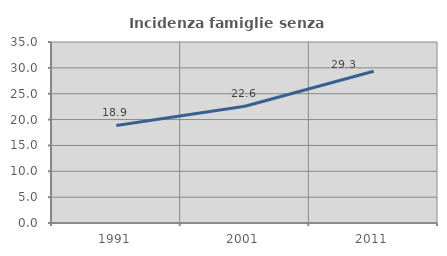
| Category | Incidenza famiglie senza nuclei |
|---|---|
| 1991.0 | 18.861 |
| 2001.0 | 22.583 |
| 2011.0 | 29.336 |